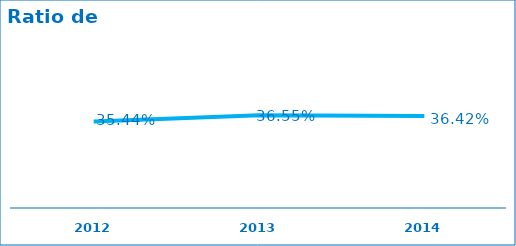
| Category | Ratio de Eficiencia |
|---|---|
| 2012.0 | 0.354 |
| 2013.0 | 0.366 |
| 2014.0 | 0.364 |